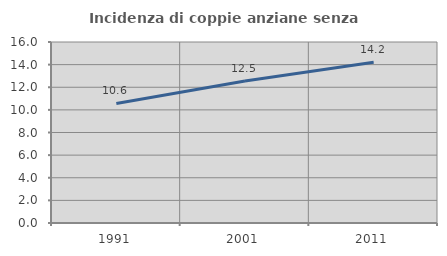
| Category | Incidenza di coppie anziane senza figli  |
|---|---|
| 1991.0 | 10.572 |
| 2001.0 | 12.545 |
| 2011.0 | 14.202 |